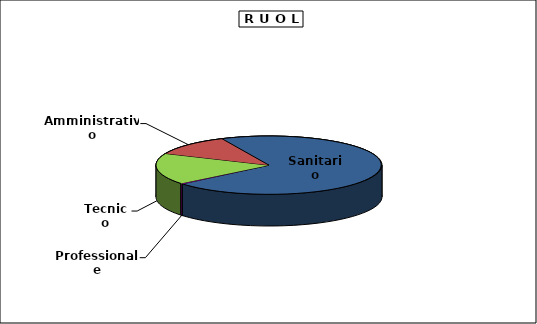
| Category | Personale |
|---|---|
| Professionale | 232 |
| Tecnico | 12838 |
| Amministrativo | 8585 |
| Sanitario | 52340 |